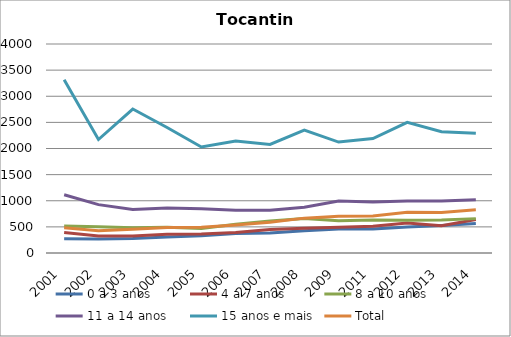
| Category | 0 a 3 anos | 4 a 7 anos | 8 a 10 anos | 11 a 14 anos | 15 anos e mais | Total |
|---|---|---|---|---|---|---|
| 2001.0 | 273.1 | 392.7 | 518.8 | 1113.8 | 3315 | 484.9 |
| 2002.0 | 267.7 | 325.1 | 504.4 | 925.3 | 2171.9 | 427.2 |
| 2003.0 | 278.8 | 324 | 481.5 | 833.4 | 2755.7 | 453.2 |
| 2004.0 | 307.6 | 357.3 | 493.5 | 863.5 | 2402.4 | 489.6 |
| 2005.0 | 331.4 | 365 | 469.7 | 848.9 | 2029.9 | 491 |
| 2006.0 | 375.1 | 394.2 | 552.3 | 818.6 | 2142.7 | 537.9 |
| 2007.0 | 383.3 | 451.6 | 612.4 | 818.4 | 2076.6 | 587.4 |
| 2008.0 | 425.7 | 473 | 658.4 | 874 | 2351.4 | 667.3 |
| 2009.0 | 461.1 | 494.3 | 616.4 | 993.8 | 2122.9 | 703.5 |
| 2011.0 | 457.6 | 510.9 | 629.8 | 977.6 | 2191.3 | 709.2 |
| 2012.0 | 499.8 | 574.4 | 627.6 | 996.8 | 2500.9 | 781.5 |
| 2013.0 | 525.7 | 523.8 | 629.3 | 997.4 | 2321.3 | 776.6 |
| 2014.0 | 562.9 | 640.8 | 657.9 | 1018 | 2292.7 | 825.8 |